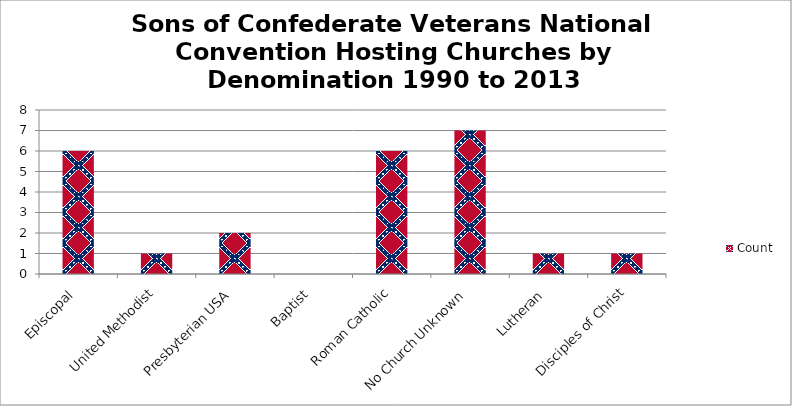
| Category | Count |
|---|---|
| Episcopal | 6 |
| United Methodist | 1 |
| Presbyterian USA | 2 |
| Baptist | 0 |
| Roman Catholic | 6 |
| No Church Unknown | 7 |
| Lutheran | 1 |
| Disciples of Christ | 1 |